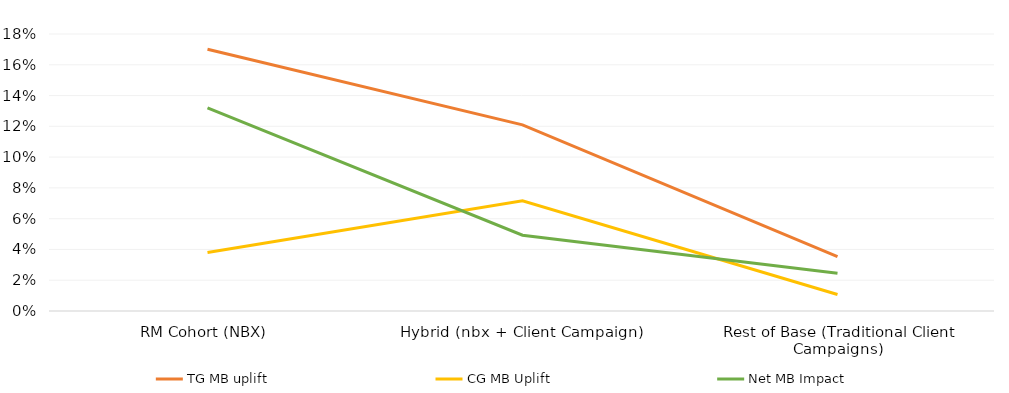
| Category | TG MB uplift  | CG MB Uplift  | Net MB Impact  |
|---|---|---|---|
| RM Cohort (NBX)  | 0.17 | 0.038 | 0.132 |
| Hybrid (nbx + Client Campaign) | 0.121 | 0.072 | 0.049 |
| Rest of Base (Traditional Client Campaigns) | 0.035 | 0.011 | 0.025 |